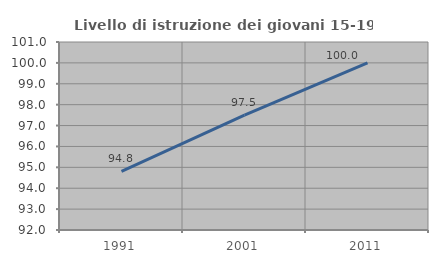
| Category | Livello di istruzione dei giovani 15-19 anni |
|---|---|
| 1991.0 | 94.805 |
| 2001.0 | 97.5 |
| 2011.0 | 100 |